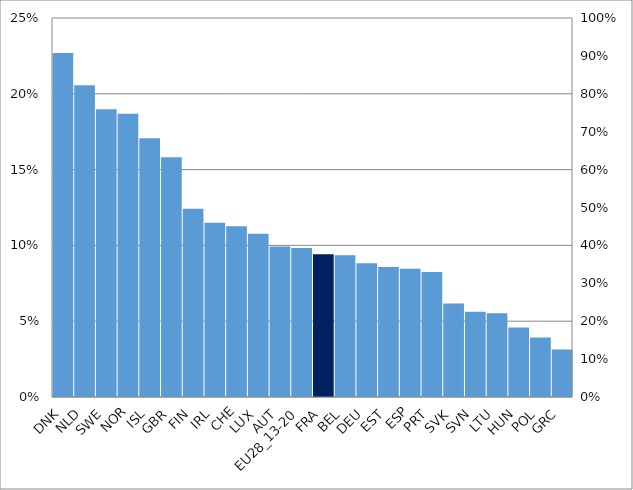
| Category | Series 0 |
|---|---|
| Danemark | 0.227 |
| Estonie | 0.086 |
| Grèce | 0.031 |
| Espagne | 0.085 |
| Finlande | 0.124 |
| France | 0.094 |
| Hongrie | 0.046 |
| Irlande | 0.115 |
| Islande | 0.171 |
| Lituanie | 0.055 |
| Luxembourg | 0.108 |
| Pays-Bas | 0.206 |
| Norvège | 0.187 |
| Pologne | 0.039 |
| Portugal | 0.082 |
| Suède | 0.19 |
| Slovénie | 0.056 |
| Slovaquie | 0.062 |
| Royaume-Uni | 0.158 |
| Suisse | 0.113 |
| UE-28 (2013-2020) | 0.098 |